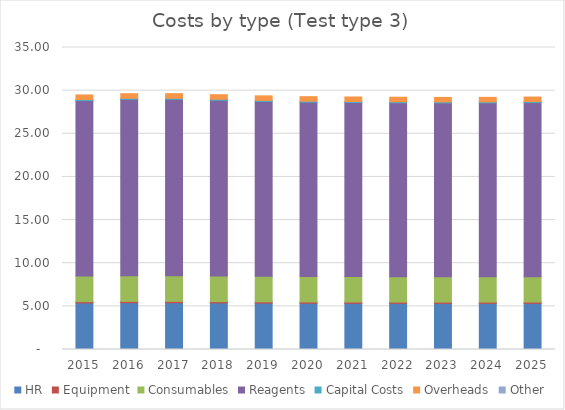
| Category | HR | Equipment | Consumables | Reagents | Capital Costs | Overheads | Other |
|---|---|---|---|---|---|---|---|
| 2015.0 | 5.391 | 0.156 | 2.968 | 20.342 | 0.117 | 0.527 | 0 |
| 2016.0 | 5.418 | 0.157 | 2.983 | 20.441 | 0.118 | 0.53 | 0 |
| 2017.0 | 5.418 | 0.157 | 2.983 | 20.443 | 0.118 | 0.53 | 0 |
| 2018.0 | 5.396 | 0.156 | 2.971 | 20.361 | 0.117 | 0.528 | 0 |
| 2019.0 | 5.372 | 0.155 | 2.957 | 20.267 | 0.117 | 0.525 | 0 |
| 2020.0 | 5.355 | 0.155 | 2.948 | 20.204 | 0.116 | 0.524 | 0 |
| 2021.0 | 5.348 | 0.155 | 2.944 | 20.179 | 0.116 | 0.523 | 0 |
| 2022.0 | 5.343 | 0.154 | 2.941 | 20.158 | 0.116 | 0.522 | 0 |
| 2023.0 | 5.339 | 0.154 | 2.939 | 20.145 | 0.116 | 0.522 | 0 |
| 2024.0 | 5.34 | 0.154 | 2.94 | 20.149 | 0.116 | 0.522 | 0 |
| 2025.0 | 5.347 | 0.155 | 2.944 | 20.174 | 0.116 | 0.523 | 0 |